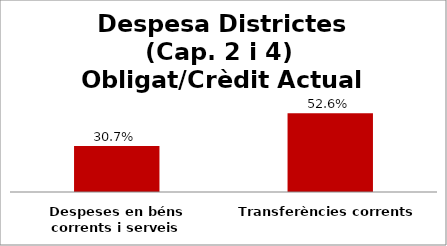
| Category | Series 0 |
|---|---|
| Despeses en béns corrents i serveis | 0.307 |
| Transferències corrents | 0.526 |